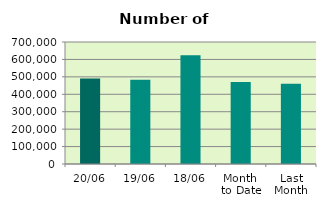
| Category | Series 0 |
|---|---|
| 20/06 | 490258 |
| 19/06 | 484014 |
| 18/06 | 624524 |
| Month 
to Date | 470917.143 |
| Last
Month | 461152.818 |